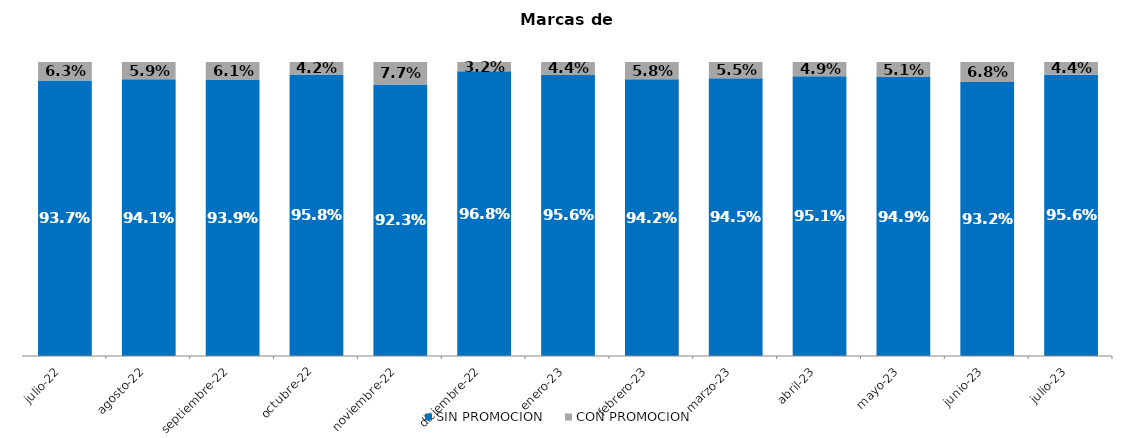
| Category | SIN PROMOCION   | CON PROMOCION   |
|---|---|---|
| 2022-07-01 | 0.937 | 0.063 |
| 2022-08-01 | 0.941 | 0.059 |
| 2022-09-01 | 0.939 | 0.061 |
| 2022-10-01 | 0.958 | 0.042 |
| 2022-11-01 | 0.923 | 0.077 |
| 2022-12-01 | 0.968 | 0.032 |
| 2023-01-01 | 0.956 | 0.044 |
| 2023-02-01 | 0.942 | 0.058 |
| 2023-03-01 | 0.945 | 0.055 |
| 2023-04-01 | 0.951 | 0.049 |
| 2023-05-01 | 0.949 | 0.051 |
| 2023-06-01 | 0.932 | 0.068 |
| 2023-07-01 | 0.956 | 0.044 |